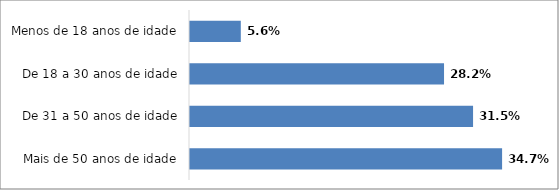
| Category | Series 0 |
|---|---|
| Mais de 50 anos de idade | 0.347 |
| De 31 a 50 anos de idade | 0.315 |
| De 18 a 30 anos de idade | 0.282 |
| Menos de 18 anos de idade | 0.056 |